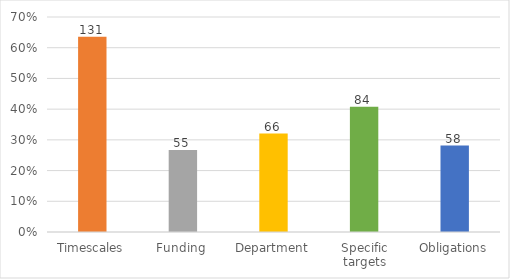
| Category | Series 0 |
|---|---|
| Timescales | 0.636 |
| Funding | 0.267 |
| Department | 0.32 |
| Specific targets | 0.408 |
| Obligations | 0.282 |